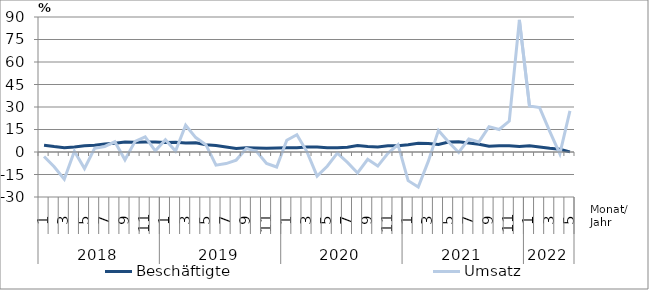
| Category | Beschäftigte | Umsatz |
|---|---|---|
| 0 | 4.5 | -3 |
| 1 | 3.6 | -9.8 |
| 2 | 2.9 | -18.1 |
| 3 | 3.4 | 0.5 |
| 4 | 4.2 | -11 |
| 5 | 4.5 | 2.5 |
| 6 | 5.3 | 3.7 |
| 7 | 5.8 | 6.8 |
| 8 | 6.6 | -5.2 |
| 9 | 6.5 | 7.1 |
| 10 | 6.6 | 10.1 |
| 11 | 6.6 | 0.8 |
| 12 | 6.4 | 8.2 |
| 13 | 6.5 | 0.6 |
| 14 | 6 | 17.8 |
| 15 | 6.1 | 9.6 |
| 16 | 4.9 | 4.9 |
| 17 | 4.3 | -8.8 |
| 18 | 3.3 | -7.7 |
| 19 | 2.4 | -5.4 |
| 20 | 2.8 | 2.4 |
| 21 | 2.7 | 0.5 |
| 22 | 2.5 | -7.6 |
| 23 | 2.7 | -10 |
| 24 | 2.9 | 7.8 |
| 25 | 2.9 | 11.5 |
| 26 | 3.4 | 0.1 |
| 27 | 3.4 | -16.1 |
| 28 | 2.9 | -9.5 |
| 29 | 2.9 | -0.8 |
| 30 | 3.1 | -6.9 |
| 31 | 4.3 | -14 |
| 32 | 3.6 | -4.9 |
| 33 | 3.4 | -9.4 |
| 34 | 4.1 | -0.9 |
| 35 | 4.1 | 4.9 |
| 36 | 4.8 | -19.1 |
| 37 | 5.8 | -23.3 |
| 38 | 5.6 | -6.1 |
| 39 | 5 | 14.4 |
| 40 | 6.6 | 6.6 |
| 41 | 6.9 | -0.3 |
| 42 | 6 | 8.7 |
| 43 | 5.2 | 6.7 |
| 44 | 3.8 | 16.9 |
| 45 | 4.2 | 15 |
| 46 | 4.2 | 20.6 |
| 47 | 3.7 | 88.1 |
| 48 | 4.1 | 30.7 |
| 49 | 3.4 | 29.6 |
| 50 | 2.5 | 13.7 |
| 51 | 1.8 | -1.3 |
| 52 | 0.1 | 27.4 |